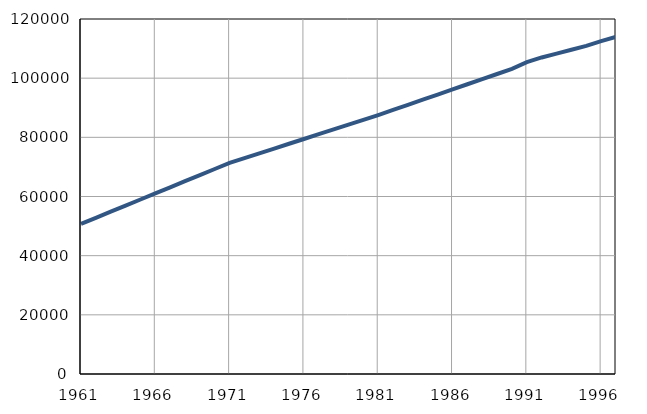
| Category | Број
становника |
|---|---|
| 1961.0 | 50747 |
| 1962.0 | 52808 |
| 1963.0 | 54869 |
| 1964.0 | 56930 |
| 1965.0 | 58991 |
| 1966.0 | 61052 |
| 1967.0 | 63113 |
| 1968.0 | 65174 |
| 1969.0 | 67235 |
| 1970.0 | 69296 |
| 1971.0 | 71357 |
| 1972.0 | 72974 |
| 1973.0 | 74591 |
| 1974.0 | 76208 |
| 1975.0 | 77825 |
| 1976.0 | 79442 |
| 1977.0 | 81059 |
| 1978.0 | 82676 |
| 1979.0 | 84293 |
| 1980.0 | 85910 |
| 1981.0 | 87531 |
| 1982.0 | 89266 |
| 1983.0 | 91001 |
| 1984.0 | 92736 |
| 1985.0 | 94471 |
| 1986.0 | 96206 |
| 1987.0 | 97941 |
| 1988.0 | 99676 |
| 1989.0 | 101411 |
| 1990.0 | 103146 |
| 1991.0 | 105400 |
| 1992.0 | 107000 |
| 1993.0 | 108300 |
| 1994.0 | 109600 |
| 1995.0 | 110900 |
| 1996.0 | 112500 |
| 1997.0 | 114000 |